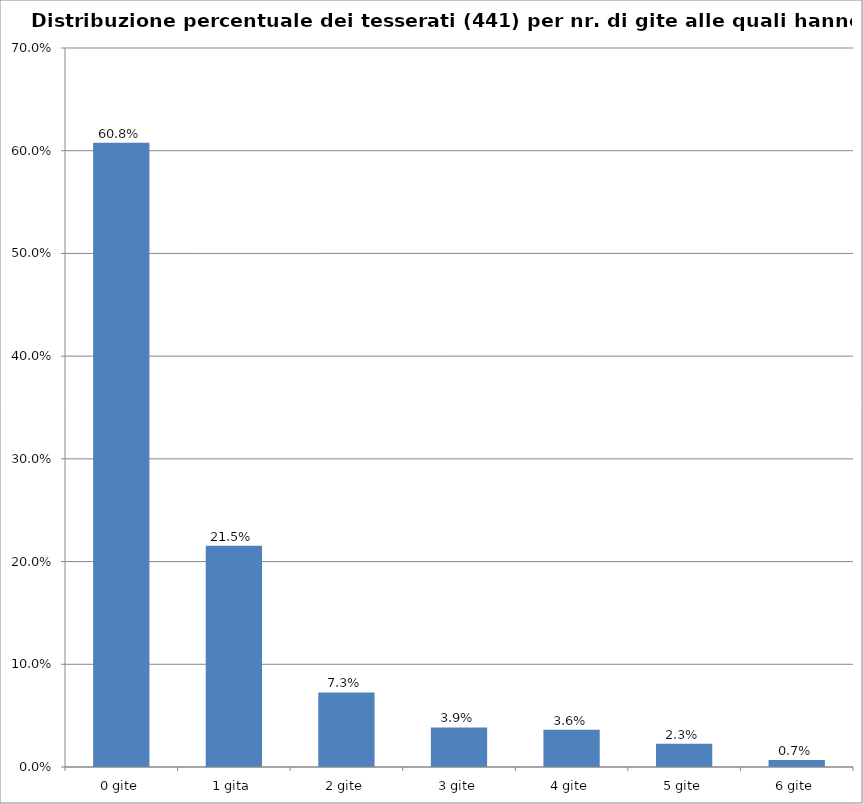
| Category | % Tesserati |
|---|---|
| 0 gite | 0.608 |
| 1 gita | 0.215 |
| 2 gite | 0.073 |
| 3 gite | 0.039 |
| 4 gite | 0.036 |
| 5 gite | 0.023 |
| 6 gite | 0.007 |